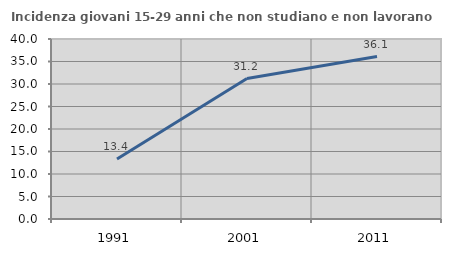
| Category | Incidenza giovani 15-29 anni che non studiano e non lavorano  |
|---|---|
| 1991.0 | 13.353 |
| 2001.0 | 31.222 |
| 2011.0 | 36.093 |